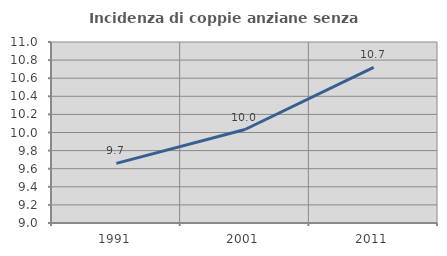
| Category | Incidenza di coppie anziane senza figli  |
|---|---|
| 1991.0 | 9.659 |
| 2001.0 | 10.033 |
| 2011.0 | 10.72 |